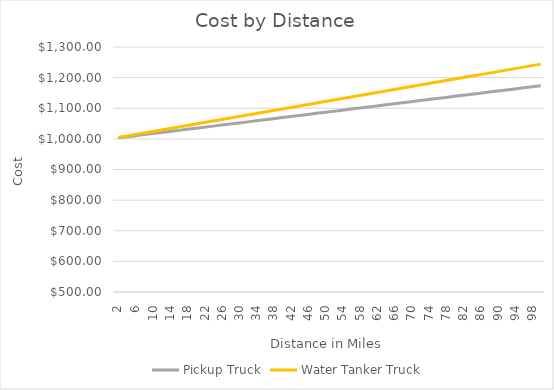
| Category | Pickup Truck | Water Tanker Truck |
|---|---|---|
| 2.0 | 1003.471 | 1004.88 |
| 4.0 | 1006.943 | 1009.761 |
| 6.0 | 1010.414 | 1014.641 |
| 8.0 | 1013.885 | 1019.521 |
| 10.0 | 1017.357 | 1024.402 |
| 12.0 | 1020.828 | 1029.282 |
| 14.0 | 1024.299 | 1034.163 |
| 16.0 | 1027.771 | 1039.043 |
| 18.0 | 1031.242 | 1043.923 |
| 20.0 | 1034.713 | 1048.804 |
| 22.0 | 1038.185 | 1053.684 |
| 24.0 | 1041.656 | 1058.564 |
| 26.0 | 1045.128 | 1063.445 |
| 28.0 | 1048.599 | 1068.325 |
| 30.0 | 1052.07 | 1073.206 |
| 32.0 | 1055.542 | 1078.086 |
| 34.0 | 1059.013 | 1082.966 |
| 36.0 | 1062.484 | 1087.847 |
| 38.0 | 1065.956 | 1092.727 |
| 40.0 | 1069.427 | 1097.607 |
| 42.0 | 1072.898 | 1102.488 |
| 44.0 | 1076.37 | 1107.368 |
| 46.0 | 1079.841 | 1112.249 |
| 48.0 | 1083.312 | 1117.129 |
| 50.0 | 1086.784 | 1122.009 |
| 52.0 | 1090.255 | 1126.89 |
| 54.0 | 1093.726 | 1131.77 |
| 56.0 | 1097.198 | 1136.65 |
| 58.0 | 1100.669 | 1141.531 |
| 60.0 | 1104.14 | 1146.411 |
| 62.0 | 1107.612 | 1151.292 |
| 64.0 | 1111.083 | 1156.172 |
| 66.0 | 1114.555 | 1161.052 |
| 68.0 | 1118.026 | 1165.933 |
| 70.0 | 1121.497 | 1170.813 |
| 72.0 | 1124.969 | 1175.693 |
| 74.0 | 1128.44 | 1180.574 |
| 76.0 | 1131.911 | 1185.454 |
| 78.0 | 1135.383 | 1190.334 |
| 80.0 | 1138.854 | 1195.215 |
| 82.0 | 1142.325 | 1200.095 |
| 84.0 | 1145.797 | 1204.976 |
| 86.0 | 1149.268 | 1209.856 |
| 88.0 | 1152.739 | 1214.736 |
| 90.0 | 1156.211 | 1219.617 |
| 92.0 | 1159.682 | 1224.497 |
| 94.0 | 1163.153 | 1229.377 |
| 96.0 | 1166.625 | 1234.258 |
| 98.0 | 1170.096 | 1239.138 |
| 100.0 | 1173.567 | 1244.019 |